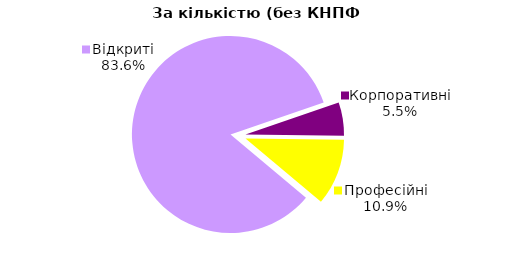
| Category | Series 0 |
|---|---|
| Відкриті | 46 |
| Корпоративні | 3 |
| Професійні | 6 |